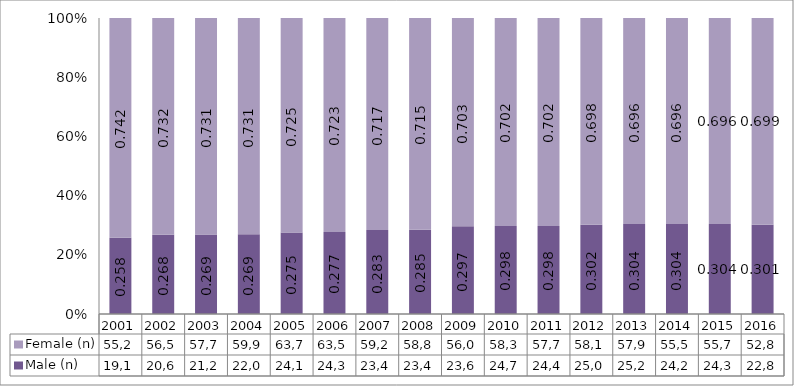
| Category | Male (n) | Female (n) |
|---|---|---|
| 2001.0 | 19194 | 55214 |
| 2002.0 | 20693 | 56580 |
| 2003.0 | 21266 | 57799 |
| 2004.0 | 22090 | 59918 |
| 2005.0 | 24183 | 63725 |
| 2006.0 | 24367 | 63566 |
| 2007.0 | 23455 | 59295 |
| 2008.0 | 23400 | 58803 |
| 2009.0 | 23629 | 56039 |
| 2010.0 | 24705 | 58302 |
| 2011.0 | 24445 | 57722 |
| 2012.0 | 25093 | 58123 |
| 2013.0 | 25292 | 57972 |
| 2014.0 | 24211 | 55519 |
| 2015.0 | 24322 | 55704 |
| 2016.0 | 22801 | 52896 |